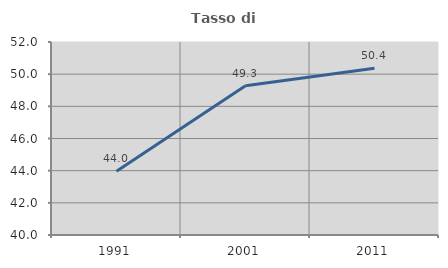
| Category | Tasso di occupazione   |
|---|---|
| 1991.0 | 43.97 |
| 2001.0 | 49.283 |
| 2011.0 | 50.364 |